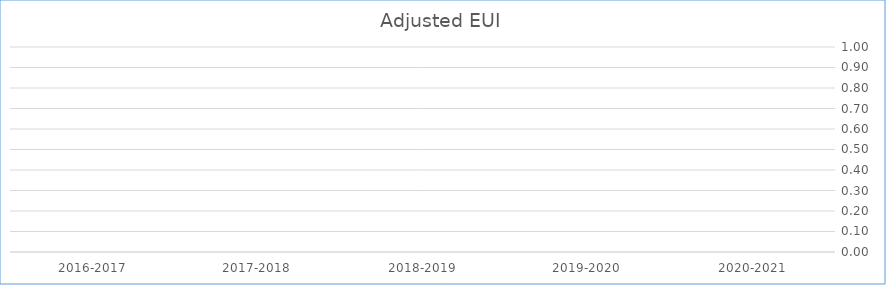
| Category | Series 0 |
|---|---|
| 2020-2021 | 0 |
| 2019-2020 | 0 |
| 2018-2019 | 0 |
| 2017-2018 | 0 |
| 2016-2017 | 0 |